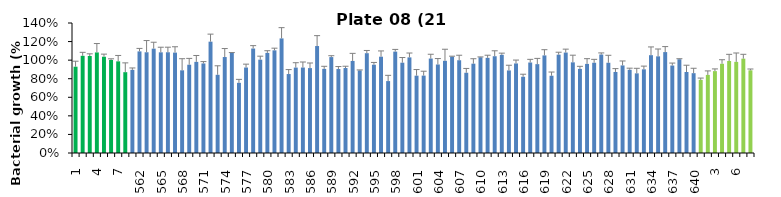
| Category | 21 h % |
|---|---|
| 1.0 | 0.929 |
| 2.0 | 1.047 |
| 3.0 | 1.045 |
| 4.0 | 1.083 |
| 5.0 | 1.037 |
| 6.0 | 1.002 |
| 7.0 | 0.987 |
| 8.0 | 0.87 |
| 561.0 | 0.896 |
| 562.0 | 1.094 |
| 563.0 | 1.085 |
| 564.0 | 1.124 |
| 565.0 | 1.084 |
| 566.0 | 1.085 |
| 567.0 | 1.081 |
| 568.0 | 0.89 |
| 569.0 | 0.951 |
| 570.0 | 0.981 |
| 571.0 | 0.964 |
| 572.0 | 1.199 |
| 573.0 | 0.842 |
| 574.0 | 1.033 |
| 575.0 | 1.081 |
| 576.0 | 0.756 |
| 577.0 | 0.921 |
| 578.0 | 1.125 |
| 579.0 | 1.005 |
| 580.0 | 1.078 |
| 581.0 | 1.106 |
| 582.0 | 1.234 |
| 583.0 | 0.85 |
| 584.0 | 0.92 |
| 585.0 | 0.921 |
| 586.0 | 0.914 |
| 587.0 | 1.152 |
| 588.0 | 0.906 |
| 589.0 | 1.033 |
| 590.0 | 0.904 |
| 591.0 | 0.915 |
| 592.0 | 0.991 |
| 593.0 | 0.889 |
| 594.0 | 1.075 |
| 595.0 | 0.951 |
| 596.0 | 1.037 |
| 597.0 | 0.774 |
| 598.0 | 1.092 |
| 599.0 | 0.973 |
| 600.0 | 1.03 |
| 601.0 | 0.833 |
| 602.0 | 0.833 |
| 603.0 | 1.017 |
| 604.0 | 0.953 |
| 605.0 | 0.993 |
| 606.0 | 1.037 |
| 607.0 | 0.999 |
| 608.0 | 0.864 |
| 609.0 | 0.962 |
| 610.0 | 1.031 |
| 611.0 | 1.025 |
| 612.0 | 1.042 |
| 613.0 | 1.057 |
| 614.0 | 0.889 |
| 615.0 | 0.964 |
| 616.0 | 0.821 |
| 617.0 | 0.975 |
| 618.0 | 0.957 |
| 619.0 | 1.051 |
| 620.0 | 0.832 |
| 621.0 | 1.059 |
| 622.0 | 1.082 |
| 623.0 | 0.976 |
| 624.0 | 0.906 |
| 625.0 | 0.959 |
| 626.0 | 0.972 |
| 627.0 | 1.06 |
| 628.0 | 0.972 |
| 629.0 | 0.873 |
| 630.0 | 0.943 |
| 631.0 | 0.896 |
| 632.0 | 0.858 |
| 633.0 | 0.901 |
| 634.0 | 1.054 |
| 635.0 | 1.041 |
| 636.0 | 1.087 |
| 637.0 | 0.942 |
| 638.0 | 1.01 |
| 639.0 | 0.872 |
| 640.0 | 0.86 |
| 1.0 | 0.788 |
| 2.0 | 0.841 |
| 3.0 | 0.882 |
| 4.0 | 0.961 |
| 5.0 | 0.991 |
| 6.0 | 0.981 |
| 7.0 | 1.016 |
| 8.0 | 0.89 |